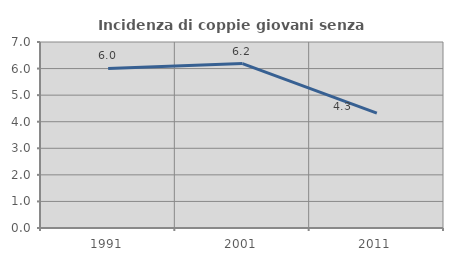
| Category | Incidenza di coppie giovani senza figli |
|---|---|
| 1991.0 | 6.004 |
| 2001.0 | 6.189 |
| 2011.0 | 4.322 |